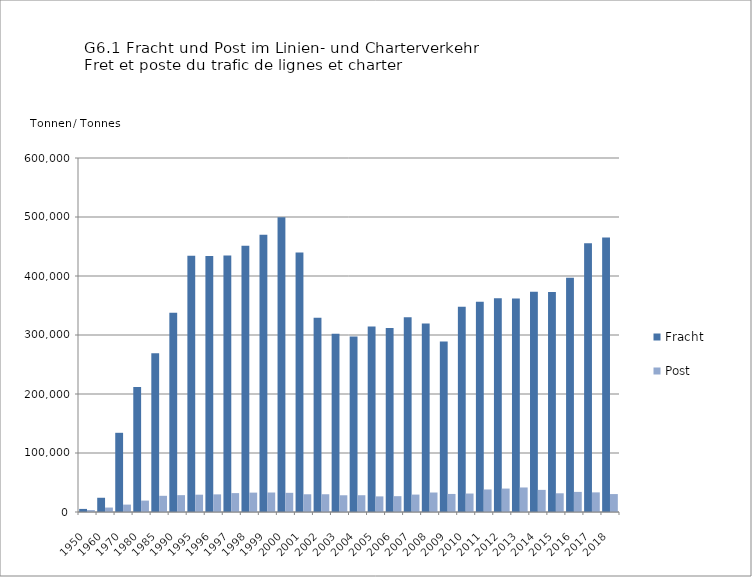
| Category | Fracht | Post |
|---|---|---|
| 1950.0 | 5237 | 3202 |
| 1960.0 | 24133 | 7534 |
| 1970.0 | 134234 | 12539 |
| 1980.0 | 211921 | 19326 |
| 1985.0 | 268957 | 27445 |
| 1990.0 | 337907 | 28567 |
| 1995.0 | 434432 | 29345 |
| 1996.0 | 433814 | 29878 |
| 1997.0 | 434646 | 32029 |
| 1998.0 | 451429 | 32849 |
| 1999.0 | 470069 | 33030 |
| 2000.0 | 499552 | 32493 |
| 2001.0 | 439710 | 30052 |
| 2002.0 | 329396 | 30094 |
| 2003.0 | 301988 | 28358 |
| 2004.0 | 297582 | 28446 |
| 2005.0 | 314334 | 26458 |
| 2006.0 | 311760 | 26828 |
| 2007.0 | 330023 | 29518 |
| 2008.0 | 319530 | 33029 |
| 2009.0 | 288855 | 30594 |
| 2010.0 | 348091 | 31298 |
| 2011.0 | 356231 | 38192 |
| 2012.0 | 362151 | 39719 |
| 2013.0 | 361681 | 41569 |
| 2014.0 | 373144 | 37489 |
| 2015.0 | 372924 | 31708 |
| 2016.0 | 397064 | 34077 |
| 2017.0 | 455345 | 33269 |
| 2018.0 | 465363 | 30387 |